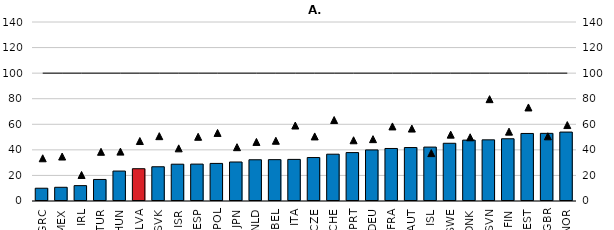
| Category | 1-9 persons employed |
|---|---|
| GRC | 9.988 |
| MEX | 10.725 |
| IRL | 12.021 |
| TUR | 16.849 |
| HUN | 23.417 |
| LVA | 25.254 |
| SVK | 26.783 |
| ISR | 28.789 |
| ESP | 28.862 |
| POL | 29.403 |
| JPN | 30.512 |
| NLD | 32.251 |
| BEL | 32.336 |
| ITA | 32.541 |
| CZE | 33.992 |
| CHE | 36.608 |
| PRT | 37.86 |
| DEU | 39.946 |
| FRA | 41.082 |
| AUT | 41.813 |
| ISL | 42.169 |
| SWE | 45.154 |
| DNK | 47.622 |
| SVN | 47.843 |
| FIN | 48.68 |
| EST | 52.824 |
| GBR | 52.91 |
| NOR | 53.914 |